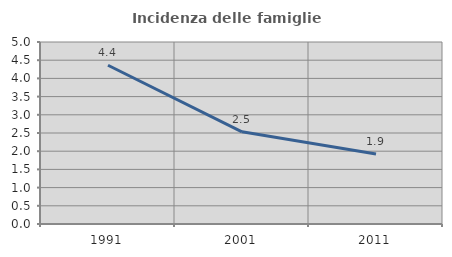
| Category | Incidenza delle famiglie numerose |
|---|---|
| 1991.0 | 4.361 |
| 2001.0 | 2.532 |
| 2011.0 | 1.925 |